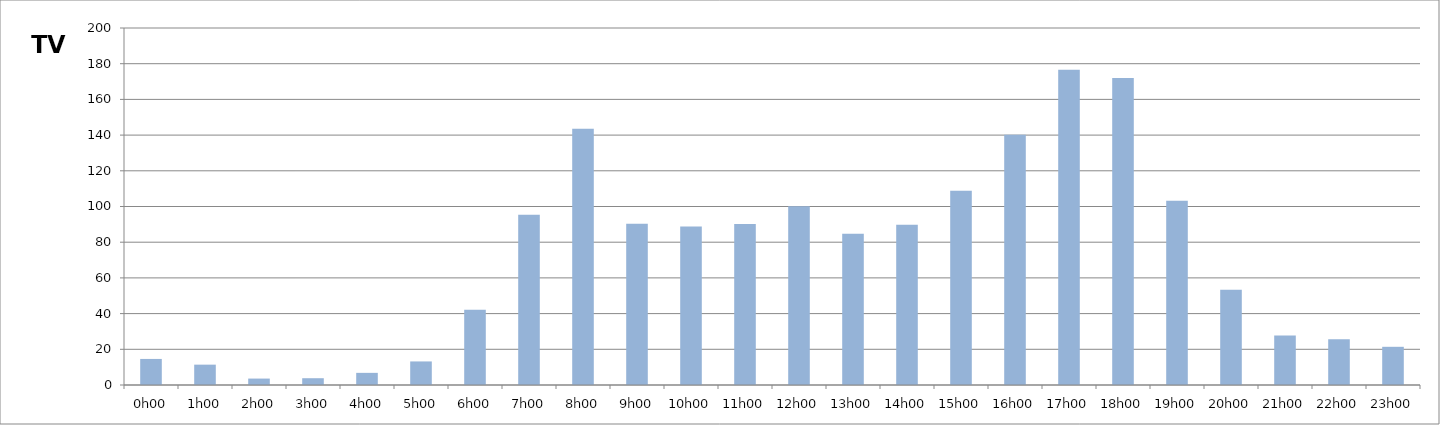
| Category | TV |
|---|---|
| 0.0 | 14.6 |
| 0.041666666666666664 | 11.4 |
| 0.08333333333333333 | 3.6 |
| 0.125 | 3.8 |
| 0.16666666666666666 | 6.8 |
| 0.20833333333333334 | 13.2 |
| 0.25 | 42.2 |
| 0.2916666666666667 | 95.4 |
| 0.3333333333333333 | 143.6 |
| 0.375 | 90.4 |
| 0.4166666666666667 | 88.8 |
| 0.4583333333333333 | 90.2 |
| 0.5 | 100.2 |
| 0.5416666666666666 | 84.8 |
| 0.5833333333333334 | 89.8 |
| 0.625 | 108.8 |
| 0.6666666666666666 | 140.2 |
| 0.7083333333333334 | 176.6 |
| 0.75 | 172 |
| 0.7916666666666666 | 103.2 |
| 0.8333333333333334 | 53.4 |
| 0.875 | 27.8 |
| 0.9166666666666666 | 25.6 |
| 0.9583333333333334 | 21.4 |